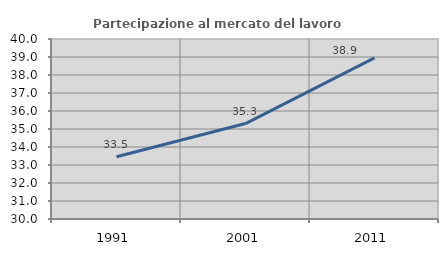
| Category | Partecipazione al mercato del lavoro  femminile |
|---|---|
| 1991.0 | 33.462 |
| 2001.0 | 35.302 |
| 2011.0 | 38.947 |